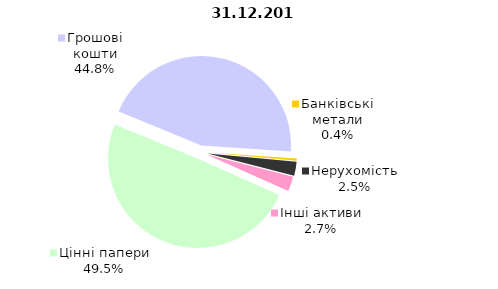
| Category | 31.12.2017 |
|---|---|
| Цінні папери | 1221.6 |
| Грошові кошти | 1105.5 |
| Банківські метали | 10.1 |
| Нерухомість | 62.6 |
| Інші активи | 65.8 |